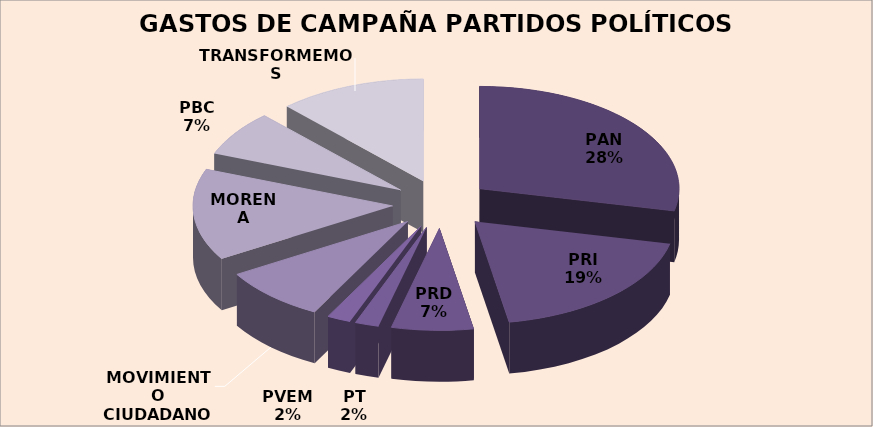
| Category | MONTO |
|---|---|
| PAN | 21384522.26 |
| PRI | 14076425.4 |
| PRD | 4969189.31 |
| PT | 1443163.23 |
| PVEM | 1443163.23 |
| MOVIMIENTO CIUDADANO | 6471855.38 |
| MORENA | 10875377.84 |
| PBC | 5392743.64 |
| TRANSFORMEMOS | 8988047.7 |